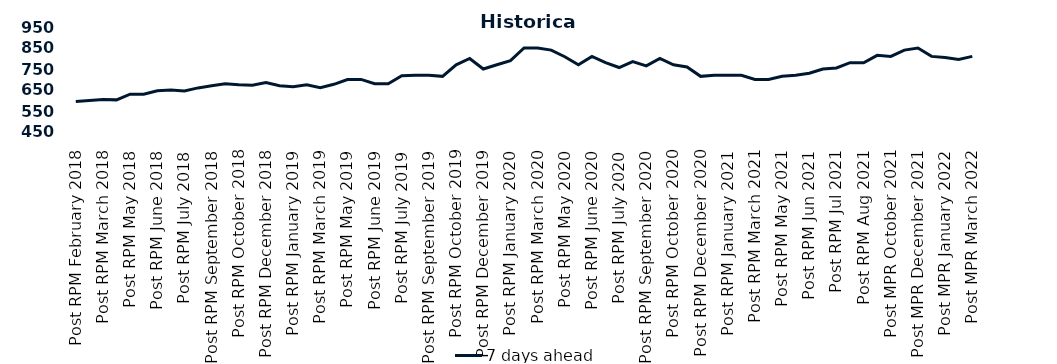
| Category | 7 days ahead |
|---|---|
| Post RPM February 2018 | 595 |
| Pre RPM March 2018 | 600 |
| Post RPM March 2018 | 605 |
| Pre RPM May 2018 | 603 |
| Post RPM May 2018 | 630 |
| Pre RPM June 2018 | 630 |
| Post RPM June 2018 | 646.5 |
| Pre RPM July 2018 | 650 |
| Post RPM July 2018 | 645 |
| Pre RPM September 2018 | 660 |
| Post RPM September 2018 | 670 |
| Pre RPM October 2018 | 680 |
| Post RPM October 2018 | 675 |
| Pre RPM December 2018 | 672.5 |
| Post RPM December 2018 | 685 |
| Pre RPM January 2019 | 670 |
| Post RPM January 2019 | 665 |
| Pre RPM March 2019 | 675 |
| Post RPM March 2019 | 661 |
| Pre RPM May 2019 | 677 |
| Post RPM May 2019 | 700 |
| Pre RPM June 2019 | 700.5 |
| Post RPM June 2019 | 680 |
| Pre RPM July 2019 | 680 |
| Post RPM July 2019 | 717.5 |
| Pre RPM September 2019 | 720 |
| Post RPM September 2019 | 720 |
| Pre RPM October 2019 | 715 |
| Post RPM October 2019 | 770 |
| Pre RPM December 2019 | 800 |
| Post RPM December 2019 | 750 |
| Pre RPM January 2020 | 770 |
| Post RPM January 2020 | 790 |
| Pre RPM March 2020 | 850 |
| Post RPM March 2020 | 850 |
| Pre RPM May 2020 | 840 |
| Post RPM May 2020 | 808.5 |
| Pre RPM June 2020 | 770 |
| Post RPM June 2020 | 810 |
| Pre RPM July 2020 | 780 |
| Post RPM July 2020 | 757 |
| Pre RPM September 2020 | 785 |
| Post RPM September 2020 | 765 |
| Pre RPM October 2020 | 800 |
| Post RPM October 2020 | 770 |
| Pre RPM December 2020 | 760 |
|  Post RPM December 2020 | 715 |
| Pre RPM January 2021 | 720 |
| Post RPM January 2021 | 720 |
|  Pre RPM March 2021 | 720 |
|  Post RPM March 2021 | 700 |
|  Pre RPM May 2021 | 700 |
|  Post RPM May 2021 | 715 |
|  Pre RPM Jun 2021 | 720 |
|   Post RPM Jun 2021 | 730 |
| Pre RPM Jul 2021 | 750 |
|  Post RPM Jul 2021 | 755 |
| Pre RPM Aug 2021 | 780 |
|  Post RPM Aug 2021 | 780 |
| Pre MPR October 2021 | 815 |
| Post MPR October 2021 | 810 |
| Pre MPR December 2021 | 840 |
| Post MPR December 2021 | 850 |
| Pre MPR January 2022 | 810 |
| Post MPR January 2022 | 805 |
| Pre MPR March 2022 | 795 |
| Post MPR March 2022 | 810 |